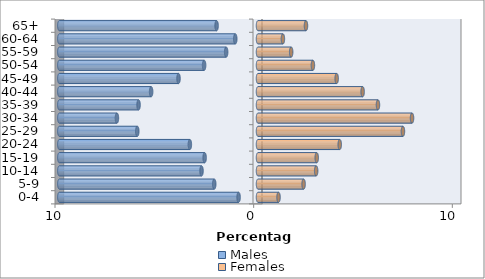
| Category | Males | Females |
|---|---|---|
| 0-4 | -0.977 | 1.034 |
| 5-9 | -2.203 | 2.295 |
| 10-14 | -2.843 | 2.928 |
| 15-19 | -2.687 | 2.956 |
| 20-24 | -3.43 | 4.114 |
| 25-29 | -6.077 | 7.296 |
| 30-34 | -7.101 | 7.754 |
| 35-39 | -6.012 | 6.039 |
| 40-44 | -5.379 | 5.267 |
| 45-49 | -4.001 | 3.96 |
| 50-54 | -2.712 | 2.764 |
| 55-59 | -1.603 | 1.67 |
| 60-64 | -1.144 | 1.253 |
| 65+ | -2.085 | 2.415 |